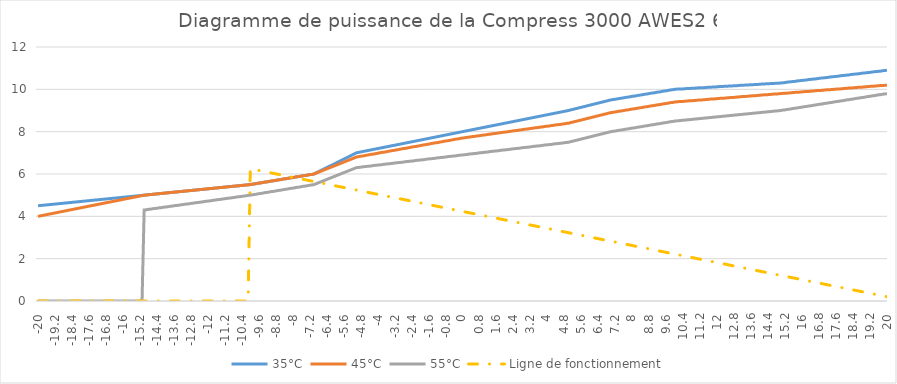
| Category | 35°C | 45°C | 55°C | Ligne de fonctionnement |
|---|---|---|---|---|
| -20.0 | 4.5 | 4 | 0 | 0 |
| -19.9 | 4.51 | 4.02 | 0 | 0 |
| -19.8 | 4.52 | 4.04 | 0 | 0 |
| -19.7 | 4.53 | 4.06 | 0 | 0 |
| -19.6 | 4.54 | 4.08 | 0 | 0 |
| -19.5 | 4.55 | 4.1 | 0 | 0 |
| -19.4 | 4.56 | 4.12 | 0 | 0 |
| -19.3 | 4.57 | 4.14 | 0 | 0 |
| -19.2 | 4.58 | 4.16 | 0 | 0 |
| -19.1 | 4.59 | 4.18 | 0 | 0 |
| -19.0 | 4.6 | 4.2 | 0 | 0 |
| -18.9 | 4.61 | 4.22 | 0 | 0 |
| -18.8 | 4.62 | 4.24 | 0 | 0 |
| -18.7 | 4.63 | 4.26 | 0 | 0 |
| -18.6 | 4.64 | 4.28 | 0 | 0 |
| -18.5 | 4.65 | 4.3 | 0 | 0 |
| -18.4 | 4.66 | 4.32 | 0 | 0 |
| -18.3 | 4.67 | 4.34 | 0 | 0 |
| -18.2 | 4.68 | 4.36 | 0 | 0 |
| -18.1 | 4.69 | 4.38 | 0 | 0 |
| -18.0 | 4.7 | 4.4 | 0 | 0 |
| -17.9 | 4.71 | 4.42 | 0 | 0 |
| -17.8 | 4.72 | 4.44 | 0 | 0 |
| -17.7 | 4.73 | 4.46 | 0 | 0 |
| -17.6 | 4.74 | 4.48 | 0 | 0 |
| -17.5 | 4.75 | 4.5 | 0 | 0 |
| -17.4 | 4.76 | 4.52 | 0 | 0 |
| -17.3 | 4.77 | 4.54 | 0 | 0 |
| -17.2 | 4.78 | 4.56 | 0 | 0 |
| -17.1 | 4.79 | 4.58 | 0 | 0 |
| -17.0 | 4.8 | 4.6 | 0 | 0 |
| -16.9 | 4.81 | 4.62 | 0 | 0 |
| -16.8 | 4.82 | 4.64 | 0 | 0 |
| -16.7 | 4.83 | 4.66 | 0 | 0 |
| -16.6 | 4.84 | 4.68 | 0 | 0 |
| -16.5 | 4.85 | 4.7 | 0 | 0 |
| -16.4 | 4.86 | 4.72 | 0 | 0 |
| -16.3 | 4.87 | 4.74 | 0 | 0 |
| -16.2 | 4.88 | 4.76 | 0 | 0 |
| -16.1 | 4.89 | 4.78 | 0 | 0 |
| -16.0 | 4.9 | 4.8 | 0 | 0 |
| -15.9 | 4.91 | 4.82 | 0 | 0 |
| -15.8 | 4.92 | 4.84 | 0 | 0 |
| -15.7 | 4.93 | 4.86 | 0 | 0 |
| -15.6 | 4.94 | 4.88 | 0 | 0 |
| -15.5 | 4.95 | 4.9 | 0 | 0 |
| -15.4 | 4.96 | 4.92 | 0 | 0 |
| -15.3 | 4.97 | 4.94 | 0 | 0 |
| -15.2 | 4.98 | 4.96 | 0 | 0 |
| -15.1 | 4.99 | 4.98 | 0 | 0 |
| -15.0 | 5 | 5 | 4.3 | 0 |
| -14.9 | 5.01 | 5.01 | 4.31 | 0 |
| -14.8 | 5.02 | 5.02 | 4.33 | 0 |
| -14.7 | 5.03 | 5.03 | 4.34 | 0 |
| -14.6 | 5.04 | 5.04 | 4.36 | 0 |
| -14.5 | 5.05 | 5.05 | 4.37 | 0 |
| -14.4 | 5.06 | 5.06 | 4.38 | 0 |
| -14.3 | 5.07 | 5.07 | 4.4 | 0 |
| -14.2 | 5.08 | 5.08 | 4.41 | 0 |
| -14.1 | 5.09 | 5.09 | 4.43 | 0 |
| -14.0 | 5.1 | 5.1 | 4.44 | 0 |
| -13.9 | 5.11 | 5.11 | 4.45 | 0 |
| -13.8 | 5.12 | 5.12 | 4.47 | 0 |
| -13.7 | 5.13 | 5.13 | 4.48 | 0 |
| -13.6 | 5.14 | 5.14 | 4.5 | 0 |
| -13.5 | 5.15 | 5.15 | 4.51 | 0 |
| -13.4 | 5.16 | 5.16 | 4.52 | 0 |
| -13.3 | 5.17 | 5.17 | 4.54 | 0 |
| -13.2 | 5.18 | 5.18 | 4.55 | 0 |
| -13.1 | 5.19 | 5.19 | 4.57 | 0 |
| -13.0 | 5.2 | 5.2 | 4.58 | 0 |
| -12.9 | 5.21 | 5.21 | 4.59 | 0 |
| -12.8 | 5.22 | 5.22 | 4.61 | 0 |
| -12.7 | 5.23 | 5.23 | 4.62 | 0 |
| -12.6 | 5.24 | 5.24 | 4.64 | 0 |
| -12.5 | 5.25 | 5.25 | 4.65 | 0 |
| -12.4 | 5.26 | 5.26 | 4.66 | 0 |
| -12.3 | 5.27 | 5.27 | 4.68 | 0 |
| -12.2 | 5.28 | 5.28 | 4.69 | 0 |
| -12.1 | 5.29 | 5.29 | 4.71 | 0 |
| -12.0 | 5.3 | 5.3 | 4.72 | 0 |
| -11.9 | 5.31 | 5.31 | 4.73 | 0 |
| -11.8 | 5.32 | 5.32 | 4.75 | 0 |
| -11.7 | 5.33 | 5.33 | 4.76 | 0 |
| -11.6 | 5.34 | 5.34 | 4.78 | 0 |
| -11.5 | 5.35 | 5.35 | 4.79 | 0 |
| -11.4 | 5.36 | 5.36 | 4.8 | 0 |
| -11.3 | 5.37 | 5.37 | 4.82 | 0 |
| -11.2 | 5.38 | 5.38 | 4.83 | 0 |
| -11.1 | 5.39 | 5.39 | 4.85 | 0 |
| -11.0 | 5.4 | 5.4 | 4.86 | 0 |
| -10.9 | 5.41 | 5.41 | 4.87 | 0 |
| -10.8 | 5.42 | 5.42 | 4.89 | 0 |
| -10.7 | 5.43 | 5.43 | 4.9 | 0 |
| -10.6 | 5.44 | 5.44 | 4.92 | 0 |
| -10.5 | 5.45 | 5.45 | 4.93 | 0 |
| -10.4 | 5.46 | 5.46 | 4.94 | 0 |
| -10.3 | 5.47 | 5.47 | 4.96 | 0 |
| -10.2 | 5.48 | 5.48 | 4.97 | 0 |
| -10.1 | 5.49 | 5.49 | 4.99 | 0 |
| -10.0 | 5.5 | 5.5 | 5 | 6.25 |
| -9.9 | 5.52 | 5.52 | 5.02 | 6.23 |
| -9.8 | 5.53 | 5.53 | 5.03 | 6.21 |
| -9.7 | 5.55 | 5.55 | 5.05 | 6.19 |
| -9.6 | 5.57 | 5.57 | 5.07 | 6.169 |
| -9.5 | 5.58 | 5.58 | 5.08 | 6.149 |
| -9.4 | 5.6 | 5.6 | 5.1 | 6.129 |
| -9.3 | 5.62 | 5.62 | 5.12 | 6.109 |
| -9.2 | 5.63 | 5.63 | 5.13 | 6.089 |
| -9.1 | 5.65 | 5.65 | 5.15 | 6.069 |
| -9.0 | 5.67 | 5.67 | 5.17 | 6.048 |
| -8.9 | 5.68 | 5.68 | 5.18 | 6.028 |
| -8.8 | 5.7 | 5.7 | 5.2 | 6.008 |
| -8.7 | 5.72 | 5.72 | 5.22 | 5.988 |
| -8.6 | 5.73 | 5.73 | 5.23 | 5.968 |
| -8.5 | 5.75 | 5.75 | 5.25 | 5.948 |
| -8.4 | 5.77 | 5.77 | 5.27 | 5.927 |
| -8.3 | 5.78 | 5.78 | 5.28 | 5.907 |
| -8.2 | 5.8 | 5.8 | 5.3 | 5.887 |
| -8.1 | 5.82 | 5.82 | 5.32 | 5.867 |
| -8.0 | 5.83 | 5.83 | 5.33 | 5.847 |
| -7.9 | 5.85 | 5.85 | 5.35 | 5.827 |
| -7.8 | 5.87 | 5.87 | 5.37 | 5.806 |
| -7.7 | 5.88 | 5.88 | 5.38 | 5.786 |
| -7.6 | 5.9 | 5.9 | 5.4 | 5.766 |
| -7.5 | 5.92 | 5.92 | 5.42 | 5.746 |
| -7.4 | 5.93 | 5.93 | 5.43 | 5.726 |
| -7.3 | 5.95 | 5.95 | 5.45 | 5.706 |
| -7.2 | 5.97 | 5.97 | 5.47 | 5.685 |
| -7.1 | 5.98 | 5.98 | 5.48 | 5.665 |
| -7.0 | 6 | 6 | 5.5 | 5.645 |
| -6.9 | 6.05 | 6.04 | 5.54 | 5.625 |
| -6.8 | 6.1 | 6.08 | 5.58 | 5.605 |
| -6.7 | 6.15 | 6.12 | 5.62 | 5.585 |
| -6.6 | 6.2 | 6.16 | 5.66 | 5.565 |
| -6.5 | 6.25 | 6.2 | 5.7 | 5.544 |
| -6.4 | 6.3 | 6.24 | 5.74 | 5.524 |
| -6.3 | 6.35 | 6.28 | 5.78 | 5.504 |
| -6.2 | 6.4 | 6.32 | 5.82 | 5.484 |
| -6.1 | 6.45 | 6.36 | 5.86 | 5.464 |
| -6.0 | 6.5 | 6.4 | 5.9 | 5.444 |
| -5.9 | 6.55 | 6.44 | 5.94 | 5.423 |
| -5.8 | 6.6 | 6.48 | 5.98 | 5.403 |
| -5.7 | 6.65 | 6.52 | 6.02 | 5.383 |
| -5.6 | 6.7 | 6.56 | 6.06 | 5.363 |
| -5.5 | 6.75 | 6.6 | 6.1 | 5.343 |
| -5.4 | 6.8 | 6.64 | 6.14 | 5.323 |
| -5.3 | 6.85 | 6.68 | 6.18 | 5.302 |
| -5.2 | 6.9 | 6.72 | 6.22 | 5.282 |
| -5.1 | 6.95 | 6.76 | 6.26 | 5.262 |
| -5.0 | 7 | 6.8 | 6.3 | 5.242 |
| -4.9 | 7.02 | 6.82 | 6.31 | 5.222 |
| -4.8 | 7.04 | 6.84 | 6.32 | 5.202 |
| -4.7 | 7.06 | 6.85 | 6.34 | 5.181 |
| -4.6 | 7.08 | 6.87 | 6.35 | 5.161 |
| -4.5 | 7.1 | 6.89 | 6.36 | 5.141 |
| -4.4 | 7.12 | 6.91 | 6.37 | 5.121 |
| -4.3 | 7.14 | 6.93 | 6.38 | 5.101 |
| -4.2 | 7.16 | 6.94 | 6.4 | 5.081 |
| -4.1 | 7.18 | 6.96 | 6.41 | 5.06 |
| -4.0 | 7.2 | 6.98 | 6.42 | 5.04 |
| -3.9 | 7.22 | 7 | 6.43 | 5.02 |
| -3.8 | 7.24 | 7.02 | 6.44 | 5 |
| -3.7 | 7.26 | 7.03 | 6.46 | 4.98 |
| -3.6 | 7.28 | 7.05 | 6.47 | 4.96 |
| -3.5 | 7.3 | 7.07 | 6.48 | 4.94 |
| -3.4 | 7.32 | 7.09 | 6.49 | 4.919 |
| -3.3 | 7.34 | 7.11 | 6.5 | 4.899 |
| -3.2 | 7.36 | 7.12 | 6.52 | 4.879 |
| -3.1 | 7.38 | 7.14 | 6.53 | 4.859 |
| -3.0 | 7.4 | 7.16 | 6.54 | 4.839 |
| -2.9 | 7.42 | 7.18 | 6.55 | 4.819 |
| -2.8 | 7.44 | 7.2 | 6.56 | 4.798 |
| -2.7 | 7.46 | 7.21 | 6.58 | 4.778 |
| -2.6 | 7.48 | 7.23 | 6.59 | 4.758 |
| -2.5 | 7.5 | 7.25 | 6.6 | 4.738 |
| -2.4 | 7.52 | 7.27 | 6.61 | 4.718 |
| -2.3 | 7.54 | 7.29 | 6.62 | 4.698 |
| -2.2 | 7.56 | 7.3 | 6.64 | 4.677 |
| -2.1 | 7.58 | 7.32 | 6.65 | 4.657 |
| -2.0 | 7.6 | 7.34 | 6.66 | 4.637 |
| -1.9 | 7.62 | 7.36 | 6.67 | 4.617 |
| -1.8 | 7.64 | 7.38 | 6.68 | 4.597 |
| -1.7 | 7.66 | 7.39 | 6.7 | 4.577 |
| -1.6 | 7.68 | 7.41 | 6.71 | 4.556 |
| -1.5 | 7.7 | 7.43 | 6.72 | 4.536 |
| -1.4 | 7.72 | 7.45 | 6.73 | 4.516 |
| -1.3 | 7.74 | 7.47 | 6.74 | 4.496 |
| -1.2 | 7.76 | 7.48 | 6.76 | 4.476 |
| -1.1 | 7.78 | 7.5 | 6.77 | 4.456 |
| -1.0 | 7.8 | 7.52 | 6.78 | 4.435 |
| -0.9 | 7.82 | 7.54 | 6.79 | 4.415 |
| -0.8 | 7.84 | 7.56 | 6.8 | 4.395 |
| -0.7 | 7.86 | 7.57 | 6.82 | 4.375 |
| -0.6 | 7.88 | 7.59 | 6.83 | 4.355 |
| -0.5 | 7.9 | 7.61 | 6.84 | 4.335 |
| -0.4 | 7.92 | 7.63 | 6.85 | 4.315 |
| -0.3 | 7.94 | 7.65 | 6.86 | 4.294 |
| -0.2 | 7.96 | 7.66 | 6.88 | 4.274 |
| -0.1 | 7.98 | 7.68 | 6.89 | 4.254 |
| 0.0 | 8 | 7.7 | 6.9 | 4.234 |
| 0.1 | 8.02 | 7.71 | 6.91 | 4.214 |
| 0.2 | 8.04 | 7.73 | 6.92 | 4.194 |
| 0.3 | 8.06 | 7.74 | 6.94 | 4.173 |
| 0.4 | 8.08 | 7.76 | 6.95 | 4.153 |
| 0.5 | 8.1 | 7.77 | 6.96 | 4.133 |
| 0.6 | 8.12 | 7.78 | 6.97 | 4.113 |
| 0.7 | 8.14 | 7.8 | 6.98 | 4.093 |
| 0.8 | 8.16 | 7.81 | 7 | 4.073 |
| 0.9 | 8.18 | 7.83 | 7.01 | 4.052 |
| 1.0 | 8.2 | 7.84 | 7.02 | 4.032 |
| 1.1 | 8.22 | 7.85 | 7.03 | 4.012 |
| 1.2 | 8.24 | 7.87 | 7.04 | 3.992 |
| 1.3 | 8.26 | 7.88 | 7.06 | 3.972 |
| 1.4 | 8.28 | 7.9 | 7.07 | 3.952 |
| 1.5 | 8.3 | 7.91 | 7.08 | 3.931 |
| 1.6 | 8.32 | 7.92 | 7.09 | 3.911 |
| 1.7 | 8.34 | 7.94 | 7.1 | 3.891 |
| 1.8 | 8.36 | 7.95 | 7.12 | 3.871 |
| 1.9 | 8.38 | 7.97 | 7.13 | 3.851 |
| 2.0 | 8.4 | 7.98 | 7.14 | 3.831 |
| 2.1 | 8.42 | 7.99 | 7.15 | 3.81 |
| 2.2 | 8.44 | 8.01 | 7.16 | 3.79 |
| 2.3 | 8.46 | 8.02 | 7.18 | 3.77 |
| 2.4 | 8.48 | 8.04 | 7.19 | 3.75 |
| 2.5 | 8.5 | 8.05 | 7.2 | 3.73 |
| 2.6 | 8.52 | 8.06 | 7.21 | 3.71 |
| 2.7 | 8.54 | 8.08 | 7.22 | 3.69 |
| 2.8 | 8.56 | 8.09 | 7.24 | 3.669 |
| 2.9 | 8.58 | 8.11 | 7.25 | 3.649 |
| 3.0 | 8.6 | 8.12 | 7.26 | 3.629 |
| 3.1 | 8.62 | 8.13 | 7.27 | 3.609 |
| 3.2 | 8.64 | 8.15 | 7.28 | 3.589 |
| 3.3 | 8.66 | 8.16 | 7.3 | 3.569 |
| 3.4 | 8.68 | 8.18 | 7.31 | 3.548 |
| 3.5 | 8.7 | 8.19 | 7.32 | 3.528 |
| 3.6 | 8.72 | 8.2 | 7.33 | 3.508 |
| 3.7 | 8.74 | 8.22 | 7.34 | 3.488 |
| 3.8 | 8.76 | 8.23 | 7.36 | 3.468 |
| 3.9 | 8.78 | 8.25 | 7.37 | 3.448 |
| 4.0 | 8.8 | 8.26 | 7.38 | 3.427 |
| 4.1 | 8.82 | 8.27 | 7.39 | 3.407 |
| 4.2 | 8.84 | 8.29 | 7.4 | 3.387 |
| 4.3 | 8.86 | 8.3 | 7.42 | 3.367 |
| 4.4 | 8.88 | 8.32 | 7.43 | 3.347 |
| 4.5 | 8.9 | 8.33 | 7.44 | 3.327 |
| 4.6 | 8.92 | 8.34 | 7.45 | 3.306 |
| 4.7 | 8.94 | 8.36 | 7.46 | 3.286 |
| 4.8 | 8.96 | 8.37 | 7.48 | 3.266 |
| 4.9 | 8.98 | 8.39 | 7.49 | 3.246 |
| 5.0 | 9 | 8.4 | 7.5 | 3.226 |
| 5.1 | 9.03 | 8.43 | 7.53 | 3.206 |
| 5.2 | 9.05 | 8.45 | 7.55 | 3.185 |
| 5.3 | 9.08 | 8.48 | 7.58 | 3.165 |
| 5.4 | 9.1 | 8.5 | 7.6 | 3.145 |
| 5.5 | 9.13 | 8.53 | 7.63 | 3.125 |
| 5.6 | 9.15 | 8.55 | 7.65 | 3.105 |
| 5.7 | 9.18 | 8.58 | 7.68 | 3.085 |
| 5.8 | 9.2 | 8.6 | 7.7 | 3.065 |
| 5.9 | 9.23 | 8.63 | 7.73 | 3.044 |
| 6.0 | 9.25 | 8.65 | 7.75 | 3.024 |
| 6.1 | 9.28 | 8.68 | 7.78 | 3.004 |
| 6.2 | 9.3 | 8.7 | 7.8 | 2.984 |
| 6.3 | 9.33 | 8.73 | 7.83 | 2.964 |
| 6.4 | 9.35 | 8.75 | 7.85 | 2.944 |
| 6.5 | 9.38 | 8.78 | 7.88 | 2.923 |
| 6.6 | 9.4 | 8.8 | 7.9 | 2.903 |
| 6.7 | 9.43 | 8.83 | 7.93 | 2.883 |
| 6.8 | 9.45 | 8.85 | 7.95 | 2.863 |
| 6.9 | 9.48 | 8.88 | 7.98 | 2.843 |
| 7.0 | 9.5 | 8.9 | 8 | 2.823 |
| 7.1 | 9.52 | 8.92 | 8.02 | 2.802 |
| 7.2 | 9.53 | 8.93 | 8.03 | 2.782 |
| 7.3 | 9.55 | 8.95 | 8.05 | 2.762 |
| 7.4 | 9.57 | 8.97 | 8.07 | 2.742 |
| 7.5 | 9.58 | 8.98 | 8.08 | 2.722 |
| 7.6 | 9.6 | 9 | 8.1 | 2.702 |
| 7.7 | 9.62 | 9.02 | 8.12 | 2.681 |
| 7.8 | 9.63 | 9.03 | 8.13 | 2.661 |
| 7.9 | 9.65 | 9.05 | 8.15 | 2.641 |
| 8.0 | 9.67 | 9.07 | 8.17 | 2.621 |
| 8.1 | 9.68 | 9.08 | 8.18 | 2.601 |
| 8.2 | 9.7 | 9.1 | 8.2 | 2.581 |
| 8.3 | 9.72 | 9.12 | 8.22 | 2.56 |
| 8.4 | 9.73 | 9.13 | 8.23 | 2.54 |
| 8.5 | 9.75 | 9.15 | 8.25 | 2.52 |
| 8.6 | 9.77 | 9.17 | 8.27 | 2.5 |
| 8.7 | 9.78 | 9.18 | 8.28 | 2.48 |
| 8.8 | 9.8 | 9.2 | 8.3 | 2.46 |
| 8.9 | 9.82 | 9.22 | 8.32 | 2.44 |
| 9.0 | 9.83 | 9.23 | 8.33 | 2.419 |
| 9.1 | 9.85 | 9.25 | 8.35 | 2.399 |
| 9.2 | 9.87 | 9.27 | 8.37 | 2.379 |
| 9.3 | 9.88 | 9.28 | 8.38 | 2.359 |
| 9.4 | 9.9 | 9.3 | 8.4 | 2.339 |
| 9.5 | 9.92 | 9.32 | 8.42 | 2.319 |
| 9.6 | 9.93 | 9.33 | 8.43 | 2.298 |
| 9.7 | 9.95 | 9.35 | 8.45 | 2.278 |
| 9.8 | 9.97 | 9.37 | 8.47 | 2.258 |
| 9.9 | 9.98 | 9.38 | 8.48 | 2.238 |
| 10.0 | 10 | 9.4 | 8.5 | 2.218 |
| 10.1 | 10.01 | 9.41 | 8.51 | 2.198 |
| 10.2 | 10.01 | 9.42 | 8.52 | 2.177 |
| 10.3 | 10.02 | 9.42 | 8.53 | 2.157 |
| 10.4 | 10.02 | 9.43 | 8.54 | 2.137 |
| 10.5 | 10.03 | 9.44 | 8.55 | 2.117 |
| 10.6 | 10.04 | 9.45 | 8.56 | 2.097 |
| 10.7 | 10.04 | 9.46 | 8.57 | 2.077 |
| 10.8 | 10.05 | 9.46 | 8.58 | 2.056 |
| 10.9 | 10.05 | 9.47 | 8.59 | 2.036 |
| 11.0 | 10.06 | 9.48 | 8.6 | 2.016 |
| 11.1 | 10.07 | 9.49 | 8.61 | 1.996 |
| 11.2 | 10.07 | 9.5 | 8.62 | 1.976 |
| 11.3 | 10.08 | 9.5 | 8.63 | 1.956 |
| 11.4 | 10.08 | 9.51 | 8.64 | 1.935 |
| 11.5 | 10.09 | 9.52 | 8.65 | 1.915 |
| 11.6 | 10.1 | 9.53 | 8.66 | 1.895 |
| 11.7 | 10.1 | 9.54 | 8.67 | 1.875 |
| 11.8 | 10.11 | 9.54 | 8.68 | 1.855 |
| 11.9 | 10.11 | 9.55 | 8.69 | 1.835 |
| 12.0 | 10.12 | 9.56 | 8.7 | 1.815 |
| 12.1 | 10.13 | 9.57 | 8.71 | 1.794 |
| 12.2 | 10.13 | 9.58 | 8.72 | 1.774 |
| 12.3 | 10.14 | 9.58 | 8.73 | 1.754 |
| 12.4 | 10.14 | 9.59 | 8.74 | 1.734 |
| 12.5 | 10.15 | 9.6 | 8.75 | 1.714 |
| 12.6 | 10.16 | 9.61 | 8.76 | 1.694 |
| 12.7 | 10.16 | 9.62 | 8.77 | 1.673 |
| 12.8 | 10.17 | 9.62 | 8.78 | 1.653 |
| 12.9 | 10.17 | 9.63 | 8.79 | 1.633 |
| 13.0 | 10.18 | 9.64 | 8.8 | 1.613 |
| 13.1 | 10.19 | 9.65 | 8.81 | 1.593 |
| 13.2 | 10.19 | 9.66 | 8.82 | 1.573 |
| 13.3 | 10.2 | 9.66 | 8.83 | 1.552 |
| 13.4 | 10.2 | 9.67 | 8.84 | 1.532 |
| 13.5 | 10.21 | 9.68 | 8.85 | 1.512 |
| 13.6 | 10.22 | 9.69 | 8.86 | 1.492 |
| 13.7 | 10.22 | 9.7 | 8.87 | 1.472 |
| 13.8 | 10.23 | 9.7 | 8.88 | 1.452 |
| 13.9 | 10.23 | 9.71 | 8.89 | 1.431 |
| 14.0 | 10.24 | 9.72 | 8.9 | 1.411 |
| 14.1 | 10.25 | 9.73 | 8.91 | 1.391 |
| 14.2 | 10.25 | 9.74 | 8.92 | 1.371 |
| 14.3 | 10.26 | 9.74 | 8.93 | 1.351 |
| 14.4 | 10.26 | 9.75 | 8.94 | 1.331 |
| 14.5 | 10.27 | 9.76 | 8.95 | 1.31 |
| 14.6 | 10.28 | 9.77 | 8.96 | 1.29 |
| 14.7 | 10.28 | 9.78 | 8.97 | 1.27 |
| 14.8 | 10.29 | 9.78 | 8.98 | 1.25 |
| 14.9 | 10.29 | 9.79 | 8.99 | 1.23 |
| 15.0 | 10.3 | 9.8 | 9 | 1.21 |
| 15.1 | 10.31 | 9.81 | 9.02 | 1.19 |
| 15.2 | 10.32 | 9.82 | 9.03 | 1.169 |
| 15.3 | 10.34 | 9.82 | 9.05 | 1.149 |
| 15.4 | 10.35 | 9.83 | 9.06 | 1.129 |
| 15.5 | 10.36 | 9.84 | 9.08 | 1.109 |
| 15.6 | 10.37 | 9.85 | 9.1 | 1.089 |
| 15.7 | 10.38 | 9.86 | 9.11 | 1.069 |
| 15.8 | 10.4 | 9.86 | 9.13 | 1.048 |
| 15.9 | 10.41 | 9.87 | 9.14 | 1.028 |
| 16.0 | 10.42 | 9.88 | 9.16 | 1.008 |
| 16.1 | 10.43 | 9.89 | 9.18 | 0.988 |
| 16.2 | 10.44 | 9.9 | 9.19 | 0.968 |
| 16.3 | 10.46 | 9.9 | 9.21 | 0.948 |
| 16.4 | 10.47 | 9.91 | 9.22 | 0.927 |
| 16.5 | 10.48 | 9.92 | 9.24 | 0.907 |
| 16.6 | 10.49 | 9.93 | 9.26 | 0.887 |
| 16.7 | 10.5 | 9.94 | 9.27 | 0.867 |
| 16.8 | 10.52 | 9.94 | 9.29 | 0.847 |
| 16.9 | 10.53 | 9.95 | 9.3 | 0.827 |
| 17.0 | 10.54 | 9.96 | 9.32 | 0.806 |
| 17.1 | 10.55 | 9.97 | 9.34 | 0.786 |
| 17.2 | 10.56 | 9.98 | 9.35 | 0.766 |
| 17.3 | 10.58 | 9.98 | 9.37 | 0.746 |
| 17.4 | 10.59 | 9.99 | 9.38 | 0.726 |
| 17.5 | 10.6 | 10 | 9.4 | 0.706 |
| 17.6 | 10.61 | 10.01 | 9.42 | 0.685 |
| 17.7 | 10.62 | 10.02 | 9.43 | 0.665 |
| 17.8 | 10.64 | 10.02 | 9.45 | 0.645 |
| 17.9 | 10.65 | 10.03 | 9.46 | 0.625 |
| 18.0 | 10.66 | 10.04 | 9.48 | 0.605 |
| 18.1 | 10.67 | 10.05 | 9.5 | 0.585 |
| 18.2 | 10.68 | 10.06 | 9.51 | 0.565 |
| 18.3 | 10.7 | 10.06 | 9.53 | 0.544 |
| 18.4 | 10.71 | 10.07 | 9.54 | 0.524 |
| 18.5 | 10.72 | 10.08 | 9.56 | 0.504 |
| 18.6 | 10.73 | 10.09 | 9.58 | 0.484 |
| 18.7 | 10.74 | 10.1 | 9.59 | 0.464 |
| 18.8 | 10.76 | 10.1 | 9.61 | 0.444 |
| 18.9 | 10.77 | 10.11 | 9.62 | 0.423 |
| 19.0 | 10.78 | 10.12 | 9.64 | 0.403 |
| 19.1 | 10.79 | 10.13 | 9.66 | 0.383 |
| 19.2 | 10.8 | 10.14 | 9.67 | 0.363 |
| 19.3 | 10.82 | 10.14 | 9.69 | 0.343 |
| 19.4 | 10.83 | 10.15 | 9.7 | 0.323 |
| 19.5 | 10.84 | 10.16 | 9.72 | 0.302 |
| 19.6 | 10.85 | 10.17 | 9.74 | 0.282 |
| 19.7 | 10.86 | 10.18 | 9.75 | 0.262 |
| 19.8 | 10.88 | 10.18 | 9.77 | 0.242 |
| 19.9 | 10.89 | 10.19 | 9.78 | 0.222 |
| 20.0 | 10.9 | 10.2 | 9.8 | 0.202 |